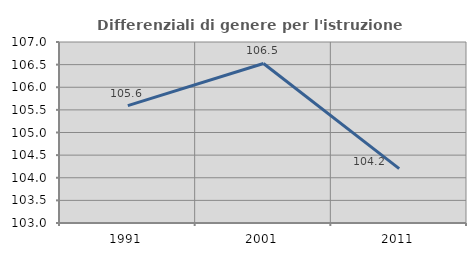
| Category | Differenziali di genere per l'istruzione superiore |
|---|---|
| 1991.0 | 105.595 |
| 2001.0 | 106.526 |
| 2011.0 | 104.202 |